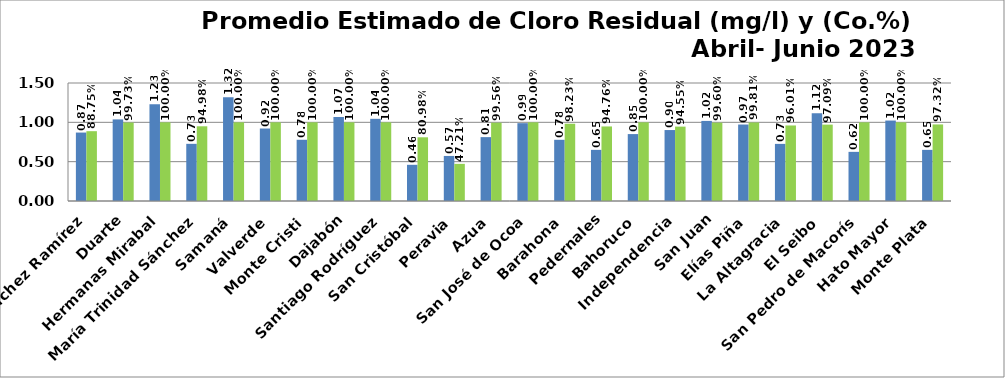
| Category | PROMEDIO TRIMESTRAL (mg/l) | PROMEDIO TRIMESTRAL (Co.%) |
|---|---|---|
| Sánchez Ramírez | 0.87 | 0.887 |
| Duarte | 1.037 | 0.997 |
| Hermanas Mirabal | 1.229 | 1 |
| María Trinidad Sánchez | 0.727 | 0.95 |
| Samaná | 1.319 | 1 |
| Valverde | 0.921 | 1 |
| Monte Cristi | 0.778 | 1 |
| Dajabón | 1.068 | 1 |
| Santiago Rodríguez | 1.045 | 1 |
| San Cristóbal | 0.46 | 0.81 |
| Peravia | 0.573 | 0.472 |
| Azua | 0.812 | 0.996 |
| San José de Ocoa | 0.989 | 1 |
| Barahona | 0.778 | 0.982 |
| Pedernales | 0.65 | 0.948 |
| Bahoruco | 0.851 | 1 |
| Independencia | 0.902 | 0.946 |
| San Juan | 1.018 | 0.996 |
| Elías Piña | 0.972 | 0.998 |
| La Altagracia | 0.726 | 0.96 |
| El Seibo | 1.117 | 0.971 |
| San Pedro de Macorís | 0.625 | 1 |
| Hato Mayor | 1.023 | 1 |
| Monte Plata | 0.65 | 0.973 |